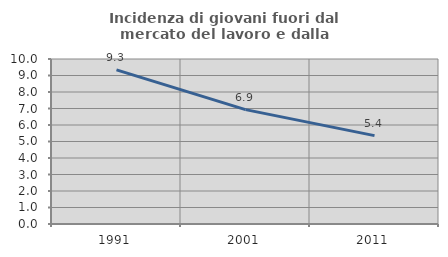
| Category | Incidenza di giovani fuori dal mercato del lavoro e dalla formazione  |
|---|---|
| 1991.0 | 9.339 |
| 2001.0 | 6.931 |
| 2011.0 | 5.357 |